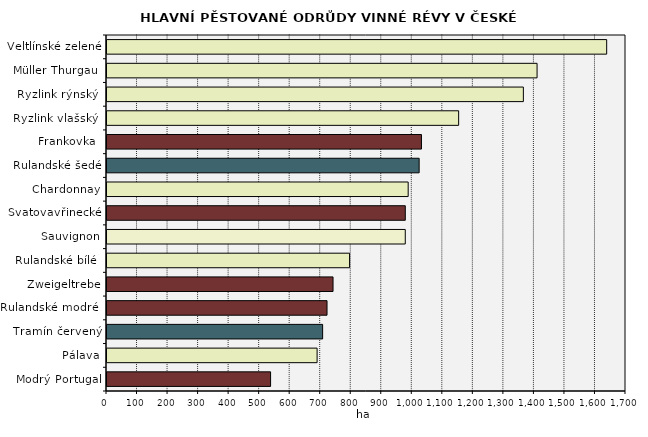
| Category | Series 0 |
|---|---|
| Veltlínské zelené | 1636.722 |
| Müller Thurgau  | 1408.71 |
| Ryzlink rýnský  | 1363.824 |
| Ryzlink vlašský  | 1151.822 |
| Frankovka  | 1030.011 |
| Rulandské šedé | 1022.463 |
| Chardonnay | 986.522 |
| Svatovavřinecké | 977.075 |
| Sauvignon | 977.019 |
| Rulandské bílé  | 794.536 |
| Zweigeltrebe | 740.406 |
| Rulandské modré  | 720.708 |
| Tramín červený | 706.336 |
| Pálava | 688.201 |
| Modrý Portugal | 535.822 |